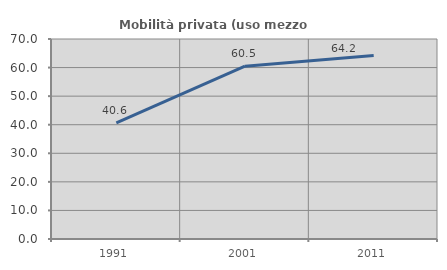
| Category | Mobilità privata (uso mezzo privato) |
|---|---|
| 1991.0 | 40.638 |
| 2001.0 | 60.474 |
| 2011.0 | 64.244 |